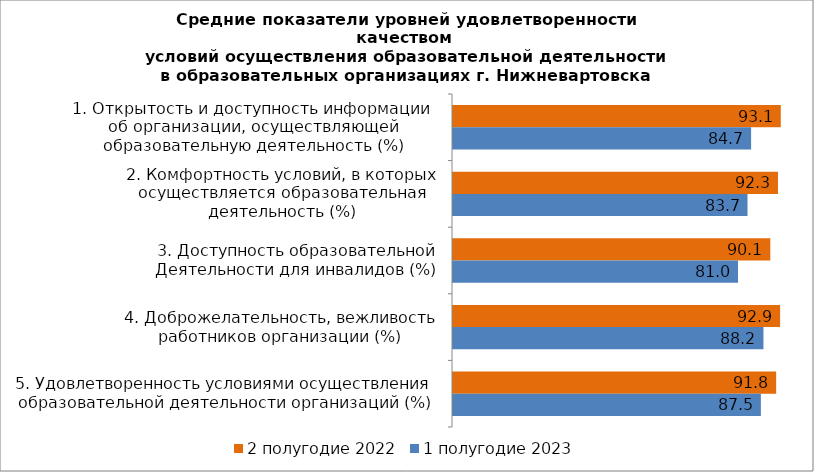
| Category | 2 полугодие 2022 | 1 полугодие 2023 |
|---|---|---|
| 1. Открытость и доступность информации 
об организации, осуществляющей
образовательную деятельность (%) | 93.123 | 84.691 |
| 2. Комфортность условий, в которых
осуществляется образовательная
деятельность (%) | 92.326 | 83.669 |
| 3. Доступность образовательной
Деятельности для инвалидов (%) | 90.143 | 80.967 |
| 4. Доброжелательность, вежливость
работников организации (%) | 92.937 | 88.197 |
| 5. Удовлетворенность условиями осуществления 
образовательной деятельности организаций (%) | 91.805 | 87.466 |